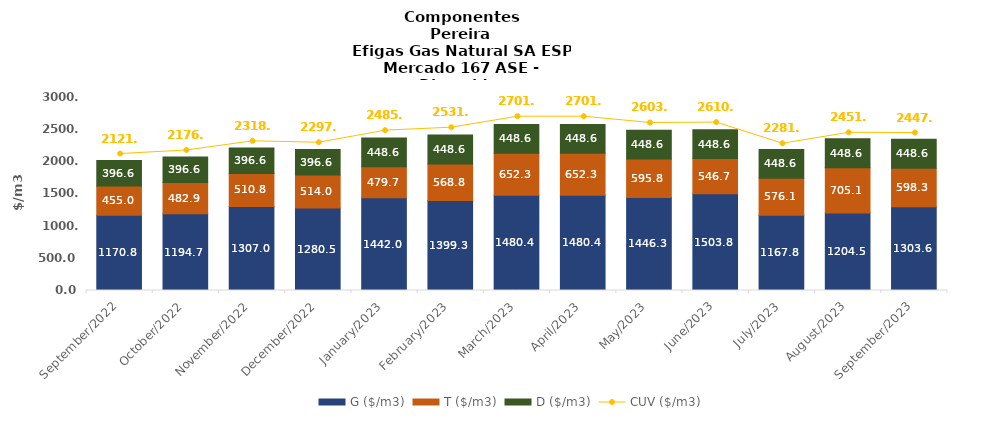
| Category | G ($/m3) | T ($/m3) | D ($/m3) |
|---|---|---|---|
| 2022-09-01 | 1170.84 | 455.02 | 396.6 |
| 2022-10-01 | 1194.65 | 482.93 | 396.6 |
| 2022-11-01 | 1306.98 | 510.84 | 396.6 |
| 2022-12-01 | 1280.49 | 513.98 | 396.6 |
| 2023-01-01 | 1442 | 479.72 | 448.63 |
| 2023-02-01 | 1399.342 | 568.805 | 448.635 |
| 2023-03-01 | 1480.39 | 652.25 | 448.635 |
| 2023-04-01 | 1480.39 | 652.25 | 448.635 |
| 2023-05-01 | 1446.347 | 595.782 | 448.635 |
| 2023-06-01 | 1503.75 | 546.731 | 448.635 |
| 2023-07-01 | 1167.85 | 576.067 | 448.635 |
| 2023-08-01 | 1204.533 | 705.123 | 448.635 |
| 2023-09-01 | 1303.571 | 598.275 | 448.635 |